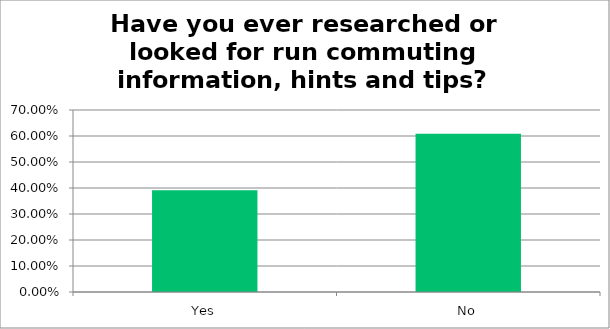
| Category | Responses |
|---|---|
| Yes | 0.392 |
| No | 0.608 |